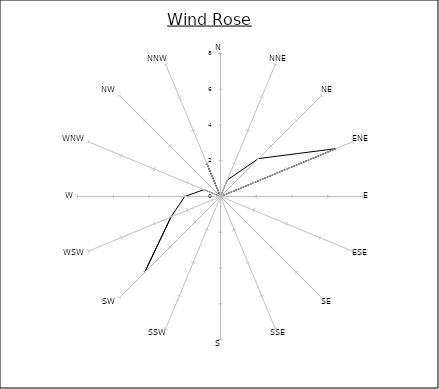
| Category | Series 0 |
|---|---|
| N | 0 |
| NNE | 1 |
| NE | 3 |
| ENE | 7 |
| E | 0 |
| ESE | 0 |
| SE | 0 |
| SSE | 0 |
| S | 0 |
| SSW | 0 |
| SW | 6 |
| WSW | 3 |
| W | 2 |
| WNW | 1 |
| NW | 0 |
| NNW | 2 |